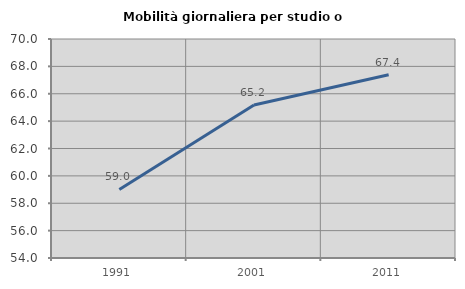
| Category | Mobilità giornaliera per studio o lavoro |
|---|---|
| 1991.0 | 59.008 |
| 2001.0 | 65.179 |
| 2011.0 | 67.388 |